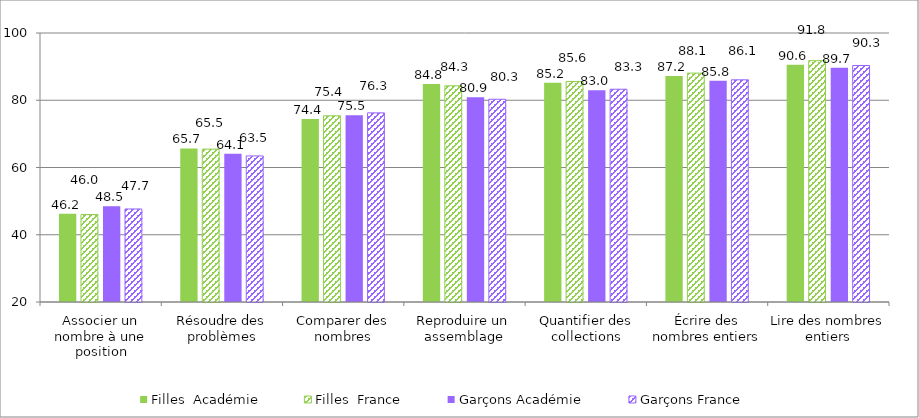
| Category | Filles  | Garçons |
|---|---|---|
| Associer un nombre à une position | 46.03 | 47.67 |
| Résoudre des problèmes | 65.47 | 63.45 |
| Comparer des nombres | 75.38 | 76.25 |
| Reproduire un assemblage | 84.31 | 80.3 |
| Quantifier des collections | 85.58 | 83.28 |
| Écrire des nombres entiers | 88.07 | 86.08 |
| Lire des nombres entiers | 91.78 | 90.33 |